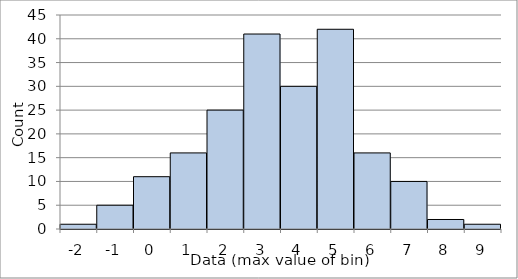
| Category | Series 0 |
|---|---|
| -2.0 | 1 |
| -1.0 | 5 |
| 0.0 | 11 |
| 1.0 | 16 |
| 2.0 | 25 |
| 3.0 | 41 |
| 4.0 | 30 |
| 5.0 | 42 |
| 6.0 | 16 |
| 7.0 | 10 |
| 8.0 | 2 |
| 9.0 | 1 |